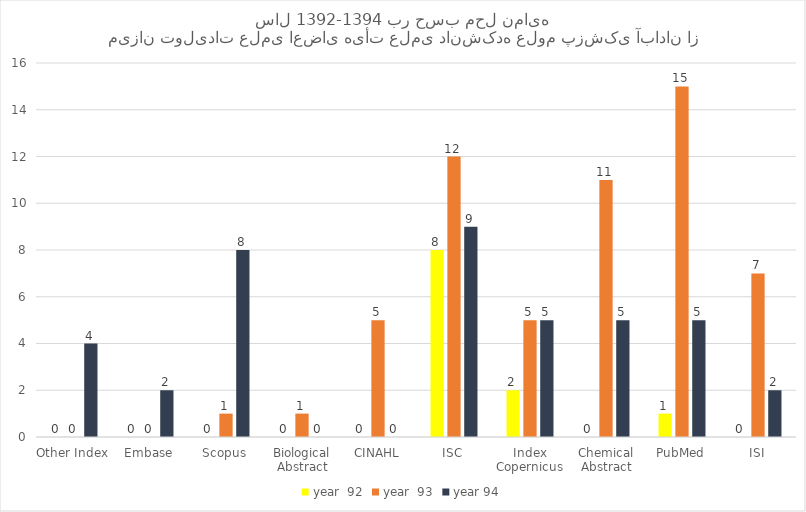
| Category | year  92 | year  93 | year 94 |
|---|---|---|---|
| Other Index | 0 | 0 | 4 |
| Embase | 0 | 0 | 2 |
| Scopus | 0 | 1 | 8 |
| Biological Abstract | 0 | 1 | 0 |
| CINAHL | 0 | 5 | 0 |
| ISC | 8 | 12 | 9 |
| Index Copernicus | 2 | 5 | 5 |
| Chemical Abstract | 0 | 11 | 5 |
| PubMed | 1 | 15 | 5 |
| ISI | 0 | 7 | 2 |